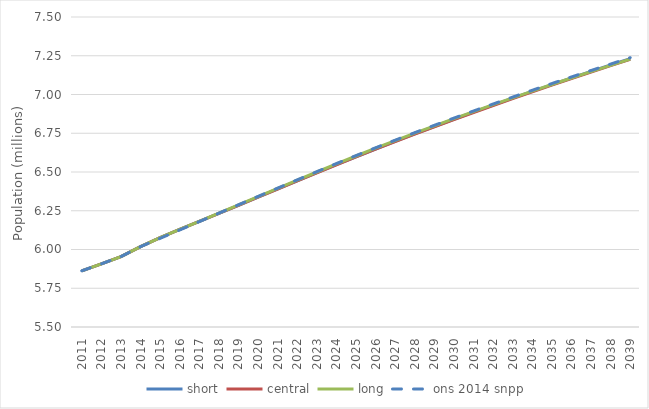
| Category | short | central | long | ons 2014 snpp |
|---|---|---|---|---|
| 2011.0 | 5.862 | 5.862 | 5.862 | 5.862 |
| 2012.0 | 5.907 | 5.907 | 5.907 | 5.907 |
| 2013.0 | 5.954 | 5.954 | 5.954 | 5.954 |
| 2014.0 | 6.018 | 6.018 | 6.018 | 6.018 |
| 2015.0 | 6.076 | 6.076 | 6.076 | 6.072 |
| 2016.0 | 6.131 | 6.131 | 6.131 | 6.126 |
| 2017.0 | 6.181 | 6.181 | 6.182 | 6.18 |
| 2018.0 | 6.233 | 6.233 | 6.235 | 6.234 |
| 2019.0 | 6.285 | 6.285 | 6.288 | 6.289 |
| 2020.0 | 6.338 | 6.338 | 6.341 | 6.342 |
| 2021.0 | 6.391 | 6.39 | 6.394 | 6.396 |
| 2022.0 | 6.443 | 6.443 | 6.447 | 6.449 |
| 2023.0 | 6.495 | 6.495 | 6.5 | 6.502 |
| 2024.0 | 6.547 | 6.546 | 6.552 | 6.554 |
| 2025.0 | 6.598 | 6.597 | 6.603 | 6.606 |
| 2026.0 | 6.648 | 6.647 | 6.653 | 6.656 |
| 2027.0 | 6.698 | 6.696 | 6.703 | 6.705 |
| 2028.0 | 6.746 | 6.744 | 6.751 | 6.754 |
| 2029.0 | 6.794 | 6.792 | 6.798 | 6.801 |
| 2030.0 | 6.84 | 6.838 | 6.844 | 6.848 |
| 2031.0 | 6.886 | 6.884 | 6.89 | 6.893 |
| 2032.0 | 6.932 | 6.929 | 6.935 | 6.939 |
| 2033.0 | 6.976 | 6.974 | 6.979 | 6.983 |
| 2034.0 | 7.02 | 7.017 | 7.022 | 7.027 |
| 2035.0 | 7.064 | 7.06 | 7.064 | 7.071 |
| 2036.0 | 7.107 | 7.103 | 7.106 | 7.113 |
| 2037.0 | 7.148 | 7.145 | 7.147 | 7.155 |
| 2038.0 | 7.19 | 7.186 | 7.188 | 7.196 |
| 2039.0 | 7.231 | 7.226 | 7.228 | 7.238 |